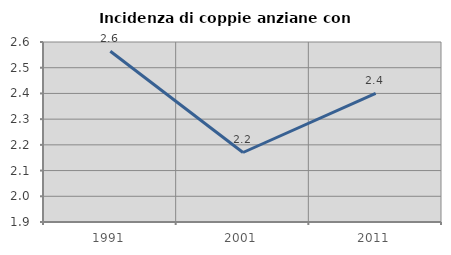
| Category | Incidenza di coppie anziane con figli |
|---|---|
| 1991.0 | 2.564 |
| 2001.0 | 2.17 |
| 2011.0 | 2.4 |